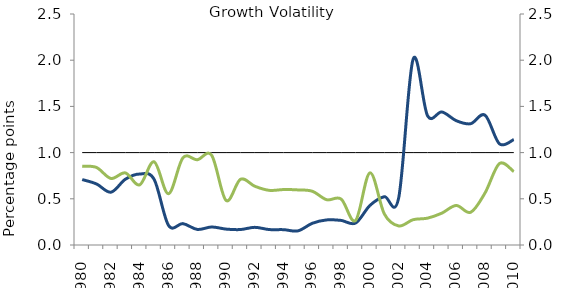
| Category | Series 0 |
|---|---|
| 1980.0 | 1 |
| 1981.0 | 1 |
| 1982.0 | 1 |
| 1983.0 | 1 |
| 1984.0 | 1 |
| 1985.0 | 1 |
| 1986.0 | 1 |
| 1987.0 | 1 |
| 1988.0 | 1 |
| 1989.0 | 1 |
| 1990.0 | 1 |
| 1991.0 | 1 |
| 1992.0 | 1 |
| 1993.0 | 1 |
| 1994.0 | 1 |
| 1995.0 | 1 |
| 1996.0 | 1 |
| 1997.0 | 1 |
| 1998.0 | 1 |
| 1999.0 | 1 |
| 2000.0 | 1 |
| 2001.0 | 1 |
| 2002.0 | 1 |
| 2003.0 | 1 |
| 2004.0 | 1 |
| 2005.0 | 1 |
| 2006.0 | 1 |
| 2007.0 | 1 |
| 2008.0 | 1 |
| 2009.0 | 1 |
| 2010.0 | 1 |